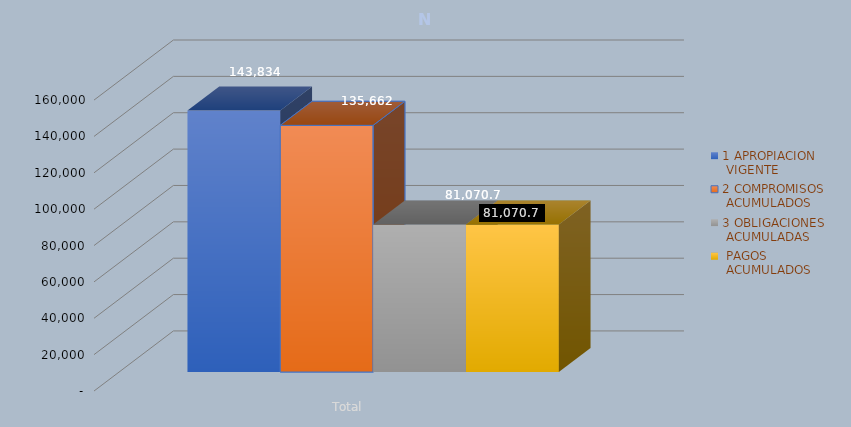
| Category | 1 APROPIACION
 VIGENTE | 2 COMPROMISOS
 ACUMULADOS | 3 OBLIGACIONES
 ACUMULADAS |  PAGOS
 ACUMULADOS |
|---|---|---|---|---|
| Total | 143833.689 | 135662.175 | 81070.685 | 81070.685 |